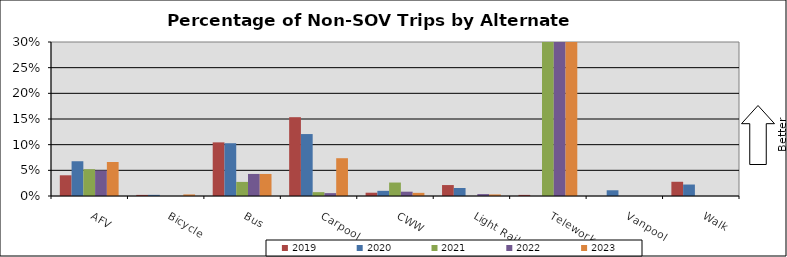
| Category | 2019 | 2020 | 2021 | 2022 | 2023 |
|---|---|---|---|---|---|
| AFV | 0.04 | 0.068 | 0.052 | 0.05 | 0.066 |
| Bicycle | 0.002 | 0.002 | 0 | 0 | 0.003 |
| Bus | 0.104 | 0.103 | 0.027 | 0.043 | 0.043 |
| Carpool | 0.154 | 0.121 | 0.007 | 0.006 | 0.074 |
| CWW | 0.006 | 0.01 | 0.026 | 0.008 | 0.006 |
| Light Rail | 0.021 | 0.016 | 0 | 0.004 | 0.003 |
| Telework | 0.002 | 0 | 0.527 | 0.426 | 0.319 |
| Vanpool | 0 | 0.011 | 0 | 0 | 0 |
| Walk | 0.028 | 0.022 | 0 | 0 | 0 |